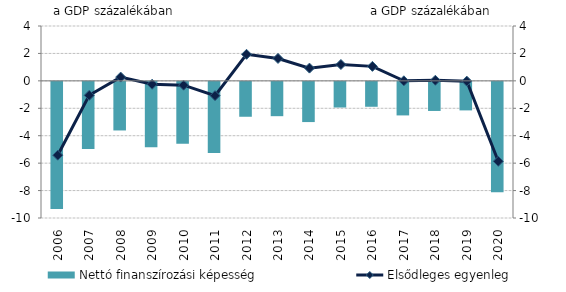
| Category | Nettó finanszírozási képesség |
|---|---|
| 2006.0 | -9.269 |
| 2007.0 | -4.902 |
| 2008.0 | -3.544 |
| 2009.0 | -4.777 |
| 2010.0 | -4.513 |
| 2011.0 | -5.194 |
| 2012.0 | -2.545 |
| 2013.0 | -2.503 |
| 2014.0 | -2.932 |
| 2015.0 | -1.871 |
| 2016.0 | -1.817 |
| 2017.0 | -2.447 |
| 2018.0 | -2.122 |
| 2019.0 | -2.081 |
| 2020.0 | -8.05 |